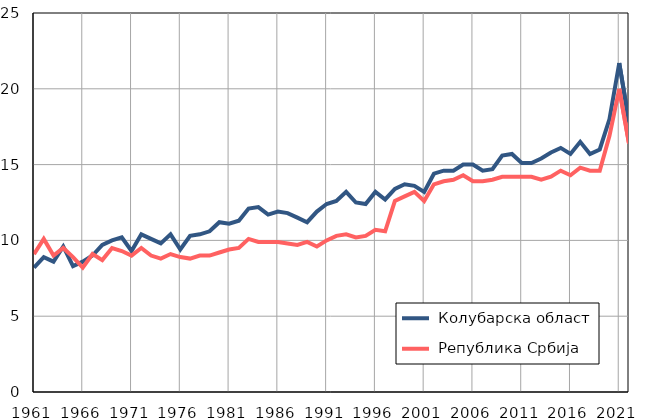
| Category |  Колубарска област |  Република Србија |
|---|---|---|
| 1961.0 | 8.2 | 9.1 |
| 1962.0 | 8.9 | 10.1 |
| 1963.0 | 8.6 | 9 |
| 1964.0 | 9.6 | 9.5 |
| 1965.0 | 8.3 | 8.9 |
| 1966.0 | 8.6 | 8.2 |
| 1967.0 | 9 | 9.1 |
| 1968.0 | 9.7 | 8.7 |
| 1969.0 | 10 | 9.5 |
| 1970.0 | 10.2 | 9.3 |
| 1971.0 | 9.3 | 9 |
| 1972.0 | 10.4 | 9.5 |
| 1973.0 | 10.1 | 9 |
| 1974.0 | 9.8 | 8.8 |
| 1975.0 | 10.4 | 9.1 |
| 1976.0 | 9.4 | 8.9 |
| 1977.0 | 10.3 | 8.8 |
| 1978.0 | 10.4 | 9 |
| 1979.0 | 10.6 | 9 |
| 1980.0 | 11.2 | 9.2 |
| 1981.0 | 11.1 | 9.4 |
| 1982.0 | 11.3 | 9.5 |
| 1983.0 | 12.1 | 10.1 |
| 1984.0 | 12.2 | 9.9 |
| 1985.0 | 11.7 | 9.9 |
| 1986.0 | 11.9 | 9.9 |
| 1987.0 | 11.8 | 9.8 |
| 1988.0 | 11.5 | 9.7 |
| 1989.0 | 11.2 | 9.9 |
| 1990.0 | 11.9 | 9.6 |
| 1991.0 | 12.4 | 10 |
| 1992.0 | 12.6 | 10.3 |
| 1993.0 | 13.2 | 10.4 |
| 1994.0 | 12.5 | 10.2 |
| 1995.0 | 12.4 | 10.3 |
| 1996.0 | 13.2 | 10.7 |
| 1997.0 | 12.7 | 10.6 |
| 1998.0 | 13.4 | 12.6 |
| 1999.0 | 13.7 | 12.9 |
| 2000.0 | 13.6 | 13.2 |
| 2001.0 | 13.2 | 12.6 |
| 2002.0 | 14.4 | 13.7 |
| 2003.0 | 14.6 | 13.9 |
| 2004.0 | 14.6 | 14 |
| 2005.0 | 15 | 14.3 |
| 2006.0 | 15 | 13.9 |
| 2007.0 | 14.6 | 13.9 |
| 2008.0 | 14.7 | 14 |
| 2009.0 | 15.6 | 14.2 |
| 2010.0 | 15.7 | 14.2 |
| 2011.0 | 15.1 | 14.2 |
| 2012.0 | 15.1 | 14.2 |
| 2013.0 | 15.4 | 14 |
| 2014.0 | 15.8 | 14.2 |
| 2015.0 | 16.1 | 14.6 |
| 2016.0 | 15.7 | 14.3 |
| 2017.0 | 16.5 | 14.8 |
| 2018.0 | 15.7 | 14.6 |
| 2019.0 | 16 | 14.6 |
| 2020.0 | 18 | 16.9 |
| 2021.0 | 21.7 | 20 |
| 2022.0 | 17.8 | 16.4 |